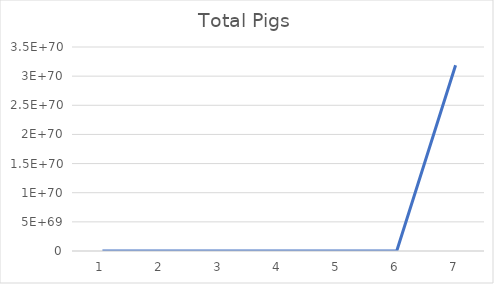
| Category | Series 0 |
|---|---|
| 1.0 | 25 |
| 2.0 | 312.5 |
| 3.0 | 48828.125 |
| 4.0 | 1192092895.508 |
| 5.0 | 710542735760100224 |
| 6.0 | 252435489670723820007271700946223104 |
| 7.0 | 31861838222649054065757112023660117849325414801738076561280196101013504 |